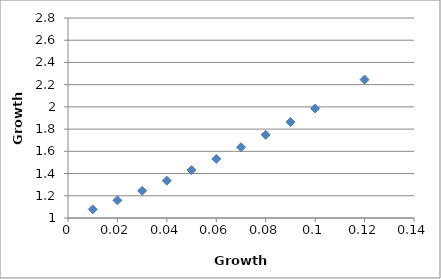
| Category | Rapporto di crescita |
|---|---|
| 0.01 | 1.077 |
| 0.02 | 1.159 |
| 0.03 | 1.245 |
| 0.04 | 1.335 |
| 0.05 | 1.431 |
| 0.06 | 1.531 |
| 0.07 | 1.637 |
| 0.08 | 1.748 |
| 0.09 | 1.864 |
| 0.1 | 1.985 |
| 0.12 | 2.246 |